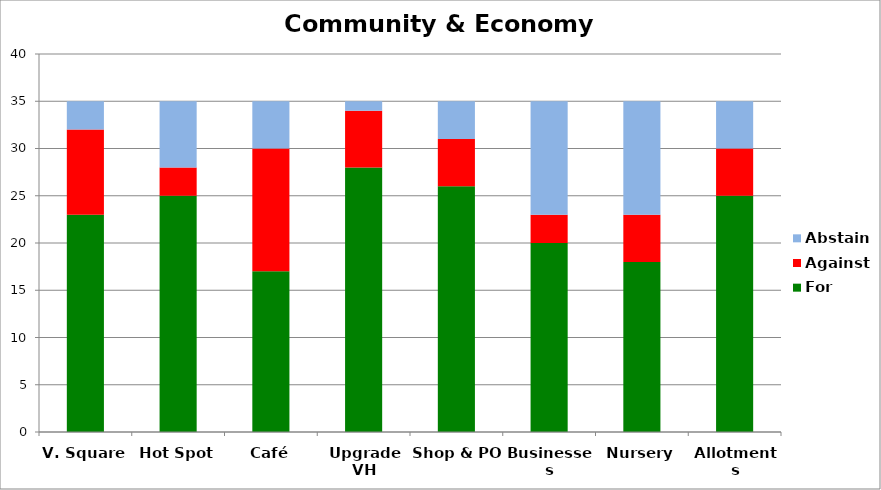
| Category | For | Against | Abstain |
|---|---|---|---|
| V. Square | 23 | 9 | 3 |
| Hot Spot | 25 | 3 | 7 |
| Café | 17 | 13 | 5 |
| Upgrade VH | 28 | 6 | 1 |
| Shop & PO | 26 | 5 | 4 |
| Businesses | 20 | 3 | 12 |
| Nursery | 18 | 5 | 12 |
| Allotments | 25 | 5 | 5 |